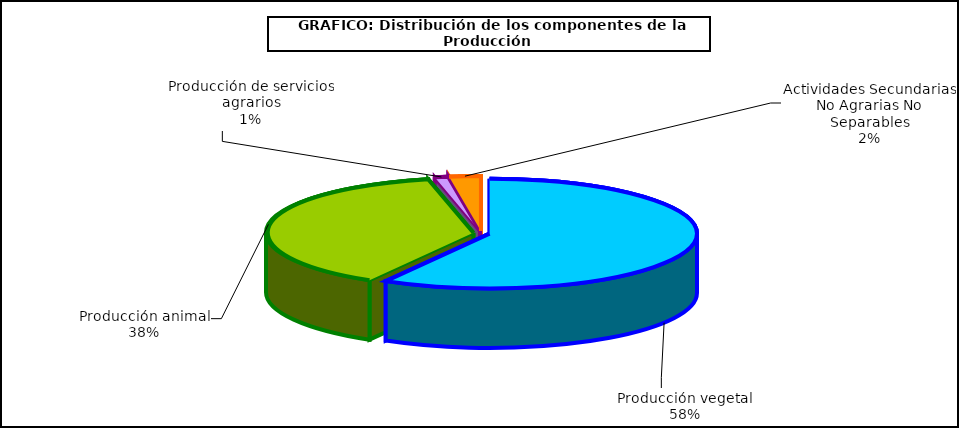
| Category | Producción rama agreria |
|---|---|
| Producción vegetal | 58.349 |
| Producción animal | 38.148 |
| Producción de servicios agrarios | 1.047 |
| Actividades Secundarias No Agrarias No Separables | 2.456 |